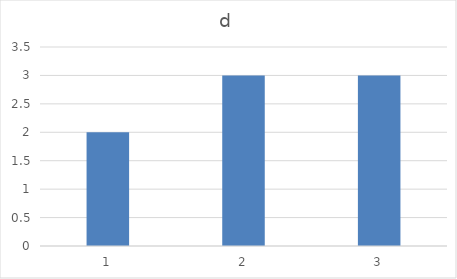
| Category | d |
|---|---|
| 0 | 2 |
| 1 | 3 |
| 2 | 3 |